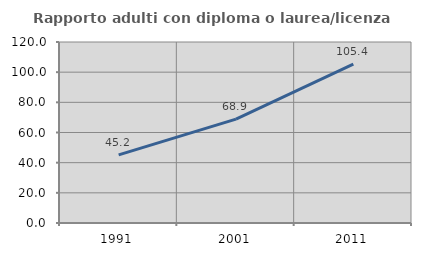
| Category | Rapporto adulti con diploma o laurea/licenza media  |
|---|---|
| 1991.0 | 45.199 |
| 2001.0 | 68.858 |
| 2011.0 | 105.365 |